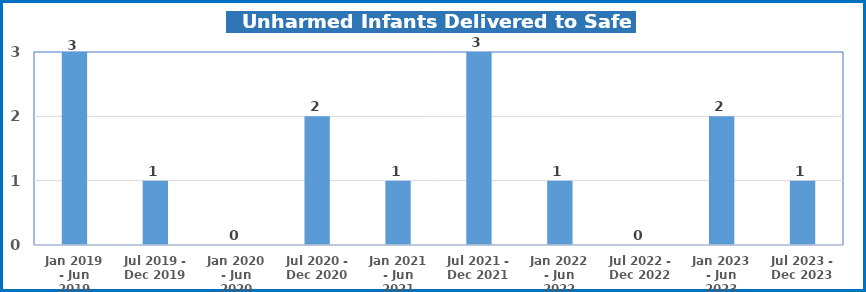
| Category | Series 0 |
|---|---|
| Jan 2019 - Jun 2019 | 3 |
| Jul 2019 - Dec 2019 | 1 |
| Jan 2020 - Jun 2020 | 0 |
| Jul 2020 - Dec 2020 | 2 |
| Jan 2021 - Jun 2021 | 1 |
| Jul 2021 - Dec 2021 | 3 |
| Jan 2022 - Jun 2022 | 1 |
| Jul 2022 - Dec 2022 | 0 |
| Jan 2023 - Jun 2023 | 2 |
| Jul 2023 - Dec 2023 | 1 |